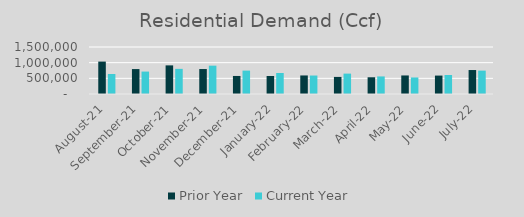
| Category | Prior Year | Current Year |
|---|---|---|
| 2021-08-01 | 1034271.241 | 637451.79 |
| 2021-09-01 | 795392.365 | 715703.433 |
| 2021-10-01 | 913450.318 | 802383.882 |
| 2021-11-01 | 796803.85 | 904247.352 |
| 2021-12-01 | 575698.992 | 746791.488 |
| 2022-01-01 | 574964.407 | 670556.394 |
| 2022-02-01 | 591912.627 | 589693.822 |
| 2022-03-01 | 545392.69 | 650741.307 |
| 2022-04-01 | 533967.423 | 560920.541 |
| 2022-05-01 | 591911.753 | 528033 |
| 2022-06-01 | 587861.265 | 605957.158 |
| 2022-07-01 | 764849.567 | 746133 |